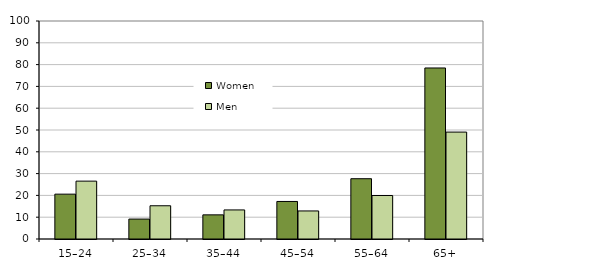
| Category | Women | Men |
|---|---|---|
| 15–24 | 20.575 | 26.546 |
| 25–34 | 9.144 | 15.247 |
| 35–44 | 11.079 | 13.336 |
| 45–54 | 17.222 | 12.866 |
| 55–64 | 27.652 | 19.95 |
| 65+ | 78.45 | 49.04 |